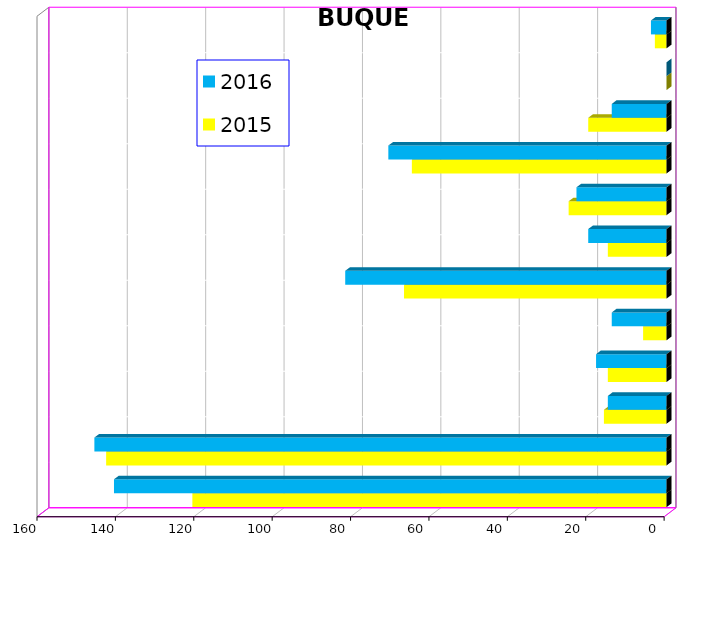
| Category | 2015 | 2016 |
|---|---|---|
| ICAVE | 121 | 141 |
| CICE | 143 | 146 |
| T. C. E. | 16 | 15 |
| CARGILL | 15 | 18 |
| TMV | 6 | 14 |
| SSA | 67 | 82 |
| SEPSA | 15 | 20 |
| VOPAK | 25 | 23 |
| CPV | 65 | 71 |
| EXCELLENCE | 20 | 14 |
| APASCO | 0 | 0 |
| SIP | 3 | 4 |